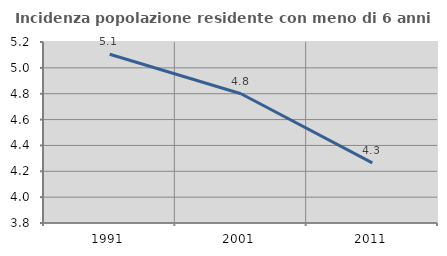
| Category | Incidenza popolazione residente con meno di 6 anni |
|---|---|
| 1991.0 | 5.105 |
| 2001.0 | 4.8 |
| 2011.0 | 4.266 |